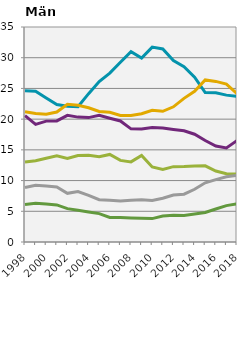
| Category |   -19 år |    20 år |    21 år |    22-25 år |    26-29 år |    30-34 år |
|---|---|---|---|---|---|---|
| 1998.0 | 24.639 | 20.568 | 13.027 | 21.192 | 8.867 | 6.101 |
| 1999.0 | 24.552 | 19.138 | 13.231 | 20.93 | 9.245 | 6.303 |
| 2000.0 | 23.442 | 19.678 | 13.62 | 20.807 | 9.107 | 6.189 |
| 2001.0 | 22.384 | 19.717 | 14.02 | 21.161 | 8.94 | 6.04 |
| 2002.0 | 22.089 | 20.613 | 13.584 | 22.429 | 7.925 | 5.428 |
| 2003.0 | 22.016 | 20.329 | 14.081 | 22.251 | 8.204 | 5.182 |
| 2004.0 | 24.146 | 20.249 | 14.135 | 21.848 | 7.601 | 4.9 |
| 2005.0 | 26.123 | 20.637 | 13.871 | 21.254 | 6.89 | 4.622 |
| 2006.0 | 27.487 | 20.155 | 14.257 | 21.108 | 6.808 | 3.989 |
| 2007.0 | 29.271 | 19.701 | 13.29 | 20.589 | 6.682 | 4.005 |
| 2008.0 | 30.982 | 18.422 | 13.04 | 20.595 | 6.791 | 3.911 |
| 2009.0 | 29.947 | 18.381 | 14.103 | 20.89 | 6.876 | 3.852 |
| 2010.0 | 31.726 | 18.636 | 12.214 | 21.446 | 6.76 | 3.809 |
| 2011.0 | 31.432 | 18.554 | 11.805 | 21.276 | 7.117 | 4.227 |
| 2012.0 | 29.532 | 18.323 | 12.264 | 22.006 | 7.656 | 4.356 |
| 2013.0 | 28.554 | 18.105 | 12.283 | 23.382 | 7.781 | 4.332 |
| 2014.0 | 26.836 | 17.541 | 12.371 | 24.538 | 8.59 | 4.554 |
| 2015.0 | 24.335 | 16.529 | 12.397 | 26.387 | 9.632 | 4.806 |
| 2016.0 | 24.301 | 15.617 | 11.546 | 26.143 | 10.162 | 5.365 |
| 2017.0 | 23.908 | 15.323 | 11.11 | 25.71 | 10.616 | 5.919 |
| 2018.0 | 23.689 | 16.512 | 11.05 | 24.163 | 10.856 | 6.209 |